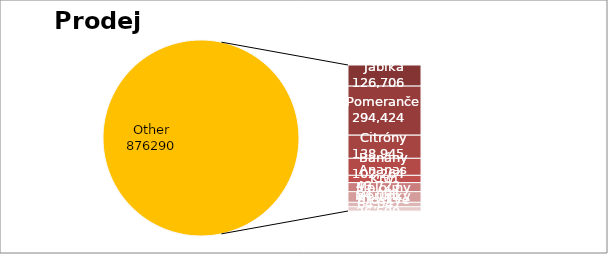
| Category | Series 0 |
|---|---|
| Jablka | 126706 |
| Pomeranče | 294424 |
| Citróny | 138945 |
| Banány | 102264 |
| Ananas | 43723 |
| Kiwi | 54096 |
| Melouny | 64047 |
| Meruňky | 26590 |
| Broskve | 25495 |